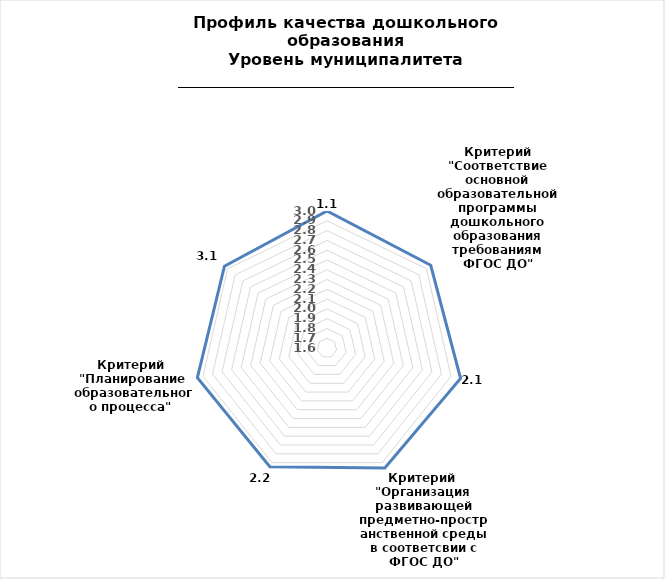
| Category | Series 0 |
|---|---|
| 0 | 3 |
| 1 | 2.956 |
| 2 | 3 |
| 3 | 2.962 |
| 4 | 2.946 |
| 5 | 2.959 |
| 6 | 2.94 |